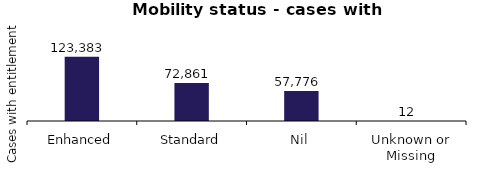
| Category | Number with Entitlement |
|---|---|
| Enhanced | 123383 |
| Standard | 72861 |
| Nil | 57776 |
| Unknown or Missing | 12 |